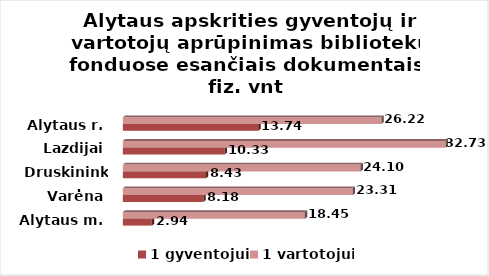
| Category | 1 gyventojui | 1 vartotojui |
|---|---|---|
| Alytaus m. | 2.945 | 18.448 |
| Varėna | 8.175 | 23.311 |
| Druskininkai | 8.433 | 24.1 |
| Lazdijai | 10.329 | 32.73 |
| Alytaus r. | 13.74 | 26.217 |